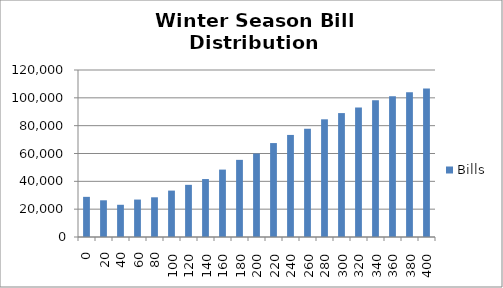
| Category | Bills |
|---|---|
| 0.0 | 28850.582 |
| 20.0 | 26375.677 |
| 40.0 | 23153.576 |
| 60.0 | 26897.18 |
| 80.0 | 28529.921 |
| 100.0 | 33347.866 |
| 120.0 | 37481.012 |
| 140.0 | 41639.636 |
| 160.0 | 48434.891 |
| 180.0 | 55433.403 |
| 200.0 | 59956.327 |
| 220.0 | 67493.649 |
| 240.0 | 73341.665 |
| 260.0 | 77783.436 |
| 280.0 | 84566.183 |
| 300.0 | 89038.705 |
| 320.0 | 92975.016 |
| 340.0 | 98221.177 |
| 360.0 | 101161.408 |
| 380.0 | 103966.674 |
| 400.0 | 106666.459 |